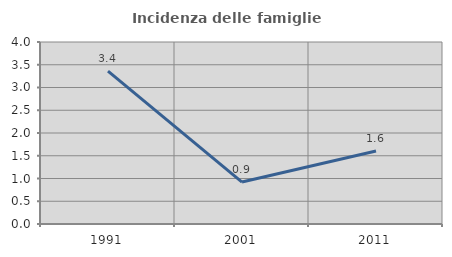
| Category | Incidenza delle famiglie numerose |
|---|---|
| 1991.0 | 3.358 |
| 2001.0 | 0.922 |
| 2011.0 | 1.606 |